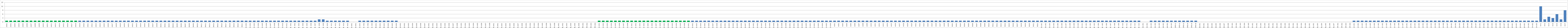
| Category | Series 0 |
|---|---|
| AW01 | 1 |
| AW02 | 1 |
| AW03 | 1 |
| AW04 | 1 |
| AW05 | 1 |
| AW06 | 1 |
| AW07 | 1 |
| AW08 | 1 |
| AW09 | 1 |
| AW10 | 1 |
| AW11 | 1 |
| AW12 | 1 |
| AW13 | 1 |
| AW14 | 1 |
| AW15 | 1 |
| AW16 | 1 |
| AW17 | 1 |
| AW18 | 1 |
| AW19 | 1 |
| AW20 | 1 |
| AW21 | 1 |
| AW22 | 1 |
| AW23 | 1 |
| AW24 | 1 |
| AW25 | 1 |
| AW26 | 1 |
| AW27 | 1 |
| AW28 | 1 |
| AW29 | 1 |
| AW30 | 1 |
| AW31 | 1 |
| AW32 | 1 |
| AW33 | 1 |
| AW34 | 1 |
| AW35 | 1 |
| AW36 | 1 |
| AW37 | 1 |
| AW38 | 1 |
| BW01 | 1 |
| BW02 | 1 |
| BW03 | 1 |
| BWO4 | 1 |
| BW05 | 1 |
| BW06 | 1 |
| BW07 | 1 |
| BW08 | 1 |
| BW09 | 1 |
| BW10 | 1 |
| BW11 | 1 |
| BW12 | 1 |
| BW13 | 1 |
| BW14 | 1 |
| BW15 | 1 |
| BW16 | 1 |
| BW17 | 1 |
| BW18 | 1 |
| BW19 | 1 |
| BW20 | 1 |
| BW21 | 1 |
| OS.W01 | 1 |
| OS.W02 | 1 |
| OS.W03 | 1 |
| OS.W04 | 1 |
| OS.W05 | 1 |
| OS.W06 | 1 |
| OS.W07 | 1 |
| OS.W08 | 1 |
| OS.W09 | 1 |
| OS.W10 | 1 |
| OS.W11 | 1 |
| OE. W01 | 1 |
| OE. W02 | 1 |
| OE. W03 | 1 |
| OE. W04 | 1 |
| OE. W05 | 1 |
| OE. W06 | 1 |
| OE. W07 | 1 |
| OE. W08 | 2 |
| OE. W09 | 2 |
| OE. W10 | 1 |
| OE. W11 | 1 |
| OE. W12 | 1 |
| OE. W13 | 1 |
| OE. W14 | 1 |
| OE. W15 | 1 |
| OA.W01 | 0 |
| OA.W02 | 0 |
| OA.W03 | 1 |
| OAN. W01 | 1 |
| OAN. W02 | 1 |
| OAN. W03 | 1 |
| OPE.W01 | 1 |
| OPE.W02 | 1 |
| OPE.W03 | 1 |
| OPE.W04 | 1 |
| OPE.W05 | 1 |
| OPE.W06 | 1 |
| B1OD.W01 | 0 |
| B1OD.W02 | 0 |
| B1OD.W03 | 0 |
| B1OD.W04 | 0 |
| B1OD.W05 | 0 |
| B1OD.W06 | 0 |
| B1OD.W07 | 0 |
| B1PZ.W01 | 0 |
| B1PZ.W02 | 0 |
| B1PZ.W03 | 0 |
| B1PZ.W04 | 0 |
| B1PZ.W05 | 0 |
| B1PZ.W06 | 0 |
| B1PZ.W07 | 0 |
| B1PZ.W08 | 0 |
| B1PS.W01 | 0 |
| B1PS.W02 | 0 |
| B1PS.W03 | 0 |
| B1PS.W04 | 0 |
| B1PS.W05 | 0 |
| B1PS.W06 | 0 |
| B1PS.W07 | 0 |
| B1PS.W08 | 0 |
| B1MŚ.W01 | 0 |
| B1MŚ.W02 | 0 |
| B1MŚ.W03 | 0 |
| B1MŚ.W04 | 0 |
| B1MŚ.W05 | 0 |
| B1MŚ.W06 | 0 |
| B1MŚ.W07 | 0 |
| B1MŚ.W08 | 0 |
| B1PO.W01 | 0 |
| B1PO.W02 | 0 |
| B1PO.W03 | 0 |
| B1PO.W04 | 0 |
| B1PO.W05 | 0 |
| B1PO.W06 | 0 |
| B1PO.W07 | 0 |
| B1PO.W08 | 0 |
| B1EL.W01 | 0 |
| B1EL.W02 | 0 |
| B1EL.W03 | 0 |
| B1EL.W04 | 0 |
| B1EL.W05 | 0 |
| B1EL.W06 | 0 |
| B1.PR.W01 | 0 |
| B1.PR.W02 | 0 |
| B1.PR.W03 | 0 |
| B1.PR.W04 | 0 |
| B1S.W01 | 1 |
| B1S.W02 | 1 |
| B1S.W03 | 1 |
| B1S.W04 | 1 |
| B1S.W05 | 1 |
| B1S.W06 | 1 |
| B1S.W07 | 1 |
| B1S.W08 | 1 |
| B2C.W01 | 1 |
| B2C.W02 | 1 |
| B2C.W03 | 1 |
| B2C.W04 | 1 |
| B2C.W05 | 1 |
| B2C.W06 | 1 |
| B2C.W07 | 1 |
| B2C.W08 | 1 |
| B2K.W01 | 1 |
| B2K.W02 | 1 |
| B2K.W03 | 1 |
| B2K.W04 | 1 |
| B2K.W05 | 1 |
| B2K.W06 | 1 |
| B2U.W01 | 1 |
| B2U.W02 | 1 |
| B2U.W03 | 1 |
| B2U.W04 | 1 |
| B2U.W05 | 1 |
| B2U.W06 | 1 |
| B2U.W07 | 1 |
| B2U.W08 | 1 |
| B2N.W01 | 1 |
| B2N.W02 | 1 |
| B2N.W03 | 1 |
| B2N.W04 | 1 |
| B2N.W05 | 1 |
| B2N.W06 | 1 |
| B2N.W07 | 1 |
| B2N.W08 | 1 |
| B2O.W01 | 1 |
| B2O.W02 | 1 |
| B2O.W03 | 1 |
| B2O.W04 | 1 |
| B2O.W05 | 1 |
| B2O.W06 | 1 |
| B2O.W07 | 1 |
| B2O.W08 | 1 |
| B2O.W09 | 1 |
| B2D.W01 | 1 |
| B2D.W02 | 1 |
| B2D.W03 | 1 |
| B2D.W04 | 1 |
| B2D.W05 | 1 |
| B2CH.W01 | 1 |
| B2CH.W02 | 1 |
| B2CH.W03 | 1 |
| B2CH.W04 | 1 |
| B2CH.W05 | 1 |
| B2CH.W06 | 1 |
| AU01 | 1 |
| AU02 | 1 |
| AU03 | 1 |
| AU04 | 1 |
| AU05 | 1 |
| AU06 | 1 |
| AU07 | 1 |
| AU08 | 1 |
| AU09 | 1 |
| AU10 | 1 |
| AU11 | 1 |
| AU12 | 1 |
| AU13 | 1 |
| AU14 | 1 |
| AU15 | 1 |
| AU16 | 1 |
| AU17 | 1 |
| AU18 | 1 |
| AU19 | 1 |
| AU20 | 1 |
| AU21 | 1 |
| AU22 | 1 |
| AU23 | 1 |
| AU24 | 1 |
| AU25 | 1 |
| AU26 | 1 |
| AU27 | 1 |
| AU28 | 1 |
| AU29 | 1 |
| BU01 | 1 |
| BU02 | 1 |
| BU03 | 1 |
| BU04 | 1 |
| BU05 | 1 |
| BU06 | 1 |
| BU07 | 1 |
| BU08 | 1 |
| BU09 | 1 |
| BU10 | 1 |
| BU11 | 1 |
| BU12 | 1 |
| BU13 | 1 |
| BU14 | 1 |
| BU15 | 1 |
| BU16 | 1 |
| BU17 | 1 |
| BU18 | 1 |
| BU19 | 1 |
| BU20 | 1 |
| BU21 | 1 |
| BU22 | 1 |
| OS.U01 | 1 |
| OS.U02 | 1 |
| OS.U03 | 1 |
| OS.U04 | 1 |
| OS.U05 | 1 |
| OS.U06 | 1 |
| OS.U07 | 1 |
| OS.U08 | 1 |
| OS.U09 | 1 |
| OS.U10 | 1 |
| OS.U11 | 1 |
| OE. U01 | 1 |
| OE. U02 | 1 |
| OE. U03 | 1 |
| OE. U04 | 1 |
| OE. U05 | 1 |
| OE. U06 | 1 |
| OE. U07 | 1 |
| OE. U08 | 1 |
| OE. U09 | 1 |
| OE. U10 | 1 |
| OE. U11 | 1 |
| OE. U12 | 1 |
| OE. U13 | 1 |
| OE. U14 | 1 |
| OA.U01 | 0 |
| OA.U02 | 0 |
| OA.U03 | 1 |
| OA.U04 | 1 |
| OA.U05 | 1 |
| OAN.U01 | 1 |
| OAN.U02 | 1 |
| OAN.U03 | 1 |
| OPE.01 | 1 |
| OPE.02 | 1 |
| OPE.03 | 1 |
| OPE.04 | 1 |
| OPE.05 | 1 |
| OPE.06 | 1 |
| B1OD.U01 | 0 |
| B1OD.U02 | 0 |
| B1OD.U03 | 0 |
| B1OD.U04 | 0 |
| B1OD.U05 | 0 |
| B1OD.U06 | 0 |
| B1OD.U07 | 0 |
| B1OD.U08 | 0 |
| B1PZ.U01 | 0 |
| B1PZ.U02 | 0 |
| B1PZ.U03 | 0 |
| B1PZ.U04 | 0 |
| B1PZ.U05 | 0 |
| B1PS.U01 | 0 |
| B1PS.U02 | 0 |
| B1PS.U03 | 0 |
| B1PS.U04 | 0 |
| B1MŚ.U01 | 0 |
| B1MŚ.U02 | 0 |
| B1MŚ.U03 | 0 |
| B1MŚ.U04 | 0 |
| B1MŚ.U05 | 0 |
| B1PO.U01 | 0 |
| B1PO.U02 | 0 |
| B1PO.U03 | 0 |
| B1PO.U04 | 0 |
| B1PO.U05 | 0 |
| B1EL.U01 | 0 |
| B1EL.U02 | 0 |
| B1EL.U03 | 0 |
| B1EL.U04 | 0 |
| B1EL.U05 | 0 |
| B1EL.U06 | 0 |
| B1EL.U07 | 0 |
| B1.RP.U01 | 0 |
| B1.RP.U02 | 0 |
| B1.RP.U03 | 0 |
| B1.RP.U04 | 0 |
| B2S.U01 | 1 |
| B2S.U02 | 1 |
| B2S.U03 | 1 |
| B2S.U04 | 1 |
| B2S.U05 | 1 |
| B2S.U06 | 1 |
| B2C.U01 | 1 |
| B2C.U02 | 1 |
| B2C.U03 | 1 |
| B2C.U04 | 1 |
| B2C.U05 | 1 |
| B2C.U06 | 1 |
| B2C.U07 | 1 |
| B2K.U01 | 1 |
| B2K.U02 | 1 |
| B2K.U03 | 1 |
| B2K.U04 | 1 |
| B2U.U01 | 1 |
| B2U.U02 | 1 |
| B2U.U03 | 1 |
| B2U.U04 | 1 |
| B2U.U05 | 1 |
| B2U.U06 | 1 |
| B2U.U07 | 1 |
| B2N.U01 | 1 |
| B2N.U02 | 1 |
| B2N.U03 | 1 |
| B2N.U04 | 1 |
| B2N.U05 | 1 |
| B2N.U06 | 1 |
| B2N.U07 | 1 |
| B2O.U01 | 1 |
| B2O.U02 | 1 |
| B2O.U03 | 1 |
| B2O.U04 | 1 |
| B2O.U05 | 1 |
| B2O.U06 | 1 |
| B2O.U07 | 1 |
| B2D.U01 | 1 |
| B2D.U02 | 1 |
| B2D.U03 | 1 |
| B2D.U04 | 1 |
| B2D.U05 | 1 |
| B2CH.U01 | 1 |
| B2CH.U02 | 1 |
| B2CH.U03 | 1 |
| B.K1 | 12 |
| B.K2 | 2 |
| B.K3 | 4 |
| B.K4 | 3 |
| B.K5 | 6 |
| B.K6 | 2 |
| B.K7 | 9 |